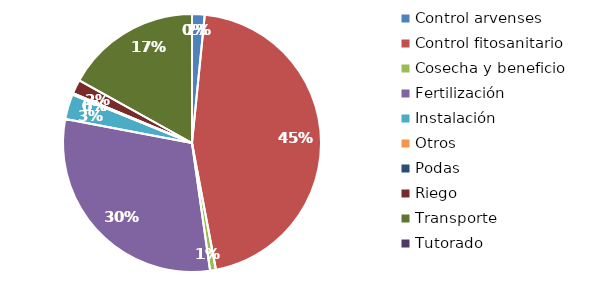
| Category | Valor |
|---|---|
| Control arvenses | 1080000 |
| Control fitosanitario | 31051100 |
| Cosecha y beneficio | 504000 |
| Fertilización | 20655000 |
| Instalación | 2140000 |
| Otros | 120000 |
| Podas | 0 |
| Riego | 1200000 |
| Transporte | 11579000 |
| Tutorado | 0 |